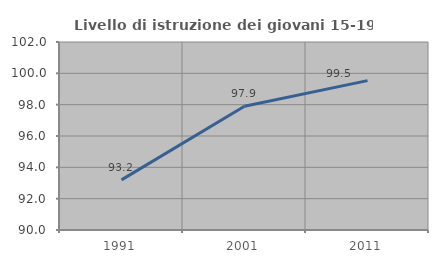
| Category | Livello di istruzione dei giovani 15-19 anni |
|---|---|
| 1991.0 | 93.2 |
| 2001.0 | 97.895 |
| 2011.0 | 99.533 |